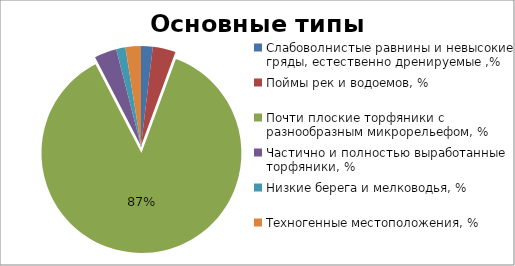
| Category | Series 0 |
|---|---|
| Слабоволнистые равнины и невысокие гряды, естественно дренируемые ,% | 1.9 |
| Поймы рек и водоемов, % | 3.7 |
| Почти плоские торфяники с разнообразным микрорельефом, % | 86.9 |
| Частично и полностью выработанные торфяники, % | 3.6 |
| Низкие берега и мелководья, % | 1.5 |
| Техногенные местоположения, % | 2.5 |